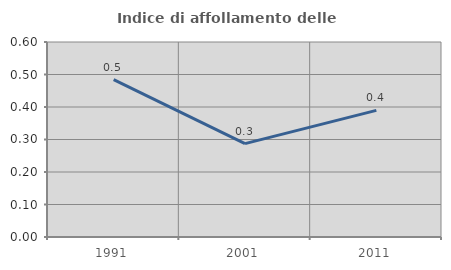
| Category | Indice di affollamento delle abitazioni  |
|---|---|
| 1991.0 | 0.484 |
| 2001.0 | 0.287 |
| 2011.0 | 0.39 |